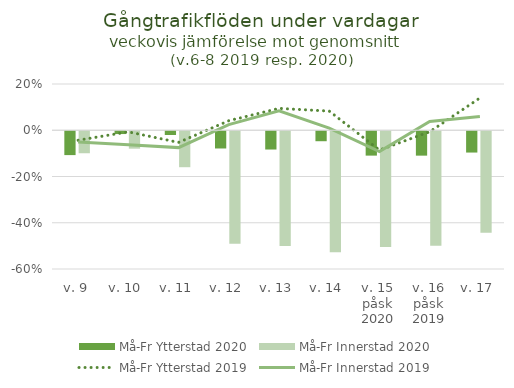
| Category | Må-Fr |
|---|---|
| v. 9 | -0.095 |
| v. 10 | -0.075 |
| v. 11 | -0.156 |
| v. 12 | -0.486 |
| v. 13 | -0.496 |
| v. 14 | -0.524 |
| v. 15 påsk 2020 | -0.501 |
| v. 16 påsk 2019 | -0.495 |
| v. 17 | -0.439 |